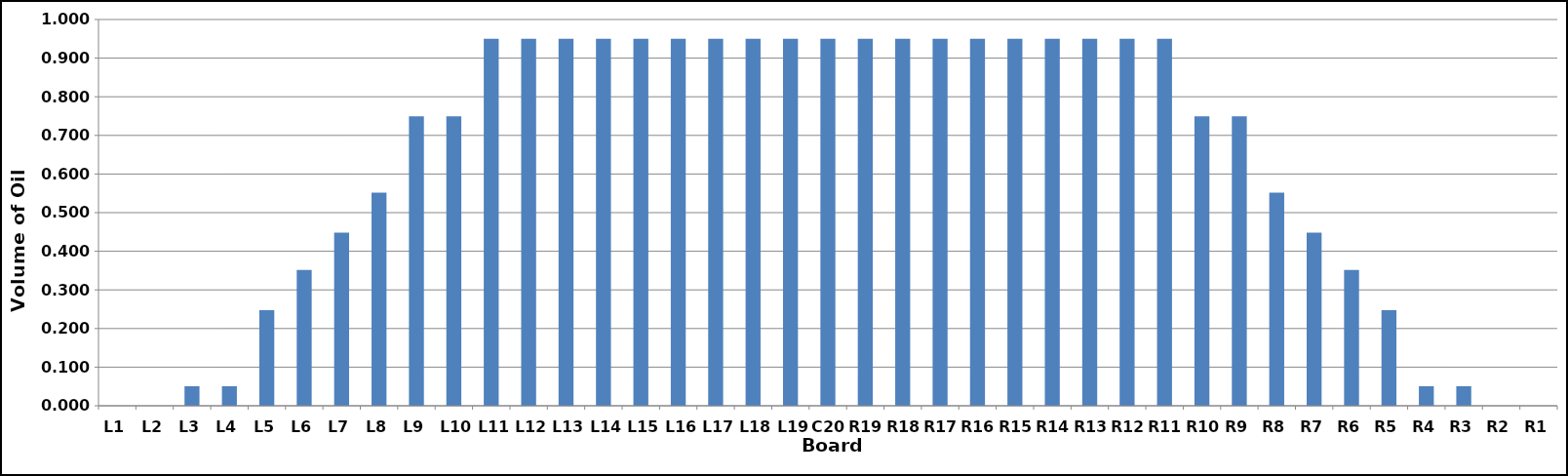
| Category | Series 0 |
|---|---|
| L1 | 0 |
| L2 | 0 |
| L3 | 0.051 |
| L4 | 0.051 |
| L5 | 0.248 |
| L6 | 0.352 |
| L7 | 0.448 |
| L8 | 0.552 |
| L9 | 0.749 |
| L10 | 0.749 |
| L11 | 0.95 |
| L12 | 0.95 |
| L13 | 0.95 |
| L14 | 0.95 |
| L15 | 0.95 |
| L16 | 0.95 |
| L17 | 0.95 |
| L18 | 0.95 |
| L19 | 0.95 |
| C20 | 0.95 |
| R19 | 0.95 |
| R18 | 0.95 |
| R17 | 0.95 |
| R16 | 0.95 |
| R15 | 0.95 |
| R14 | 0.95 |
| R13 | 0.95 |
| R12 | 0.95 |
| R11 | 0.95 |
| R10 | 0.749 |
| R9 | 0.749 |
| R8 | 0.552 |
| R7 | 0.448 |
| R6 | 0.352 |
| R5 | 0.248 |
| R4 | 0.051 |
| R3 | 0.051 |
| R2 | 0 |
| R1 | 0 |